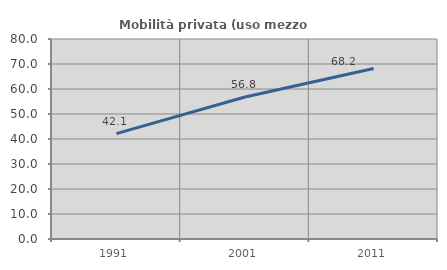
| Category | Mobilità privata (uso mezzo privato) |
|---|---|
| 1991.0 | 42.144 |
| 2001.0 | 56.801 |
| 2011.0 | 68.194 |